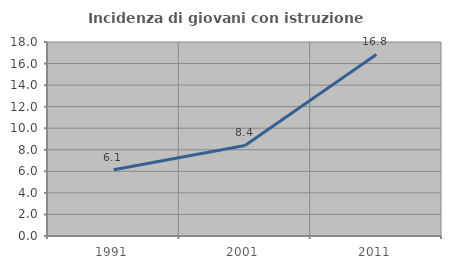
| Category | Incidenza di giovani con istruzione universitaria |
|---|---|
| 1991.0 | 6.14 |
| 2001.0 | 8.399 |
| 2011.0 | 16.842 |